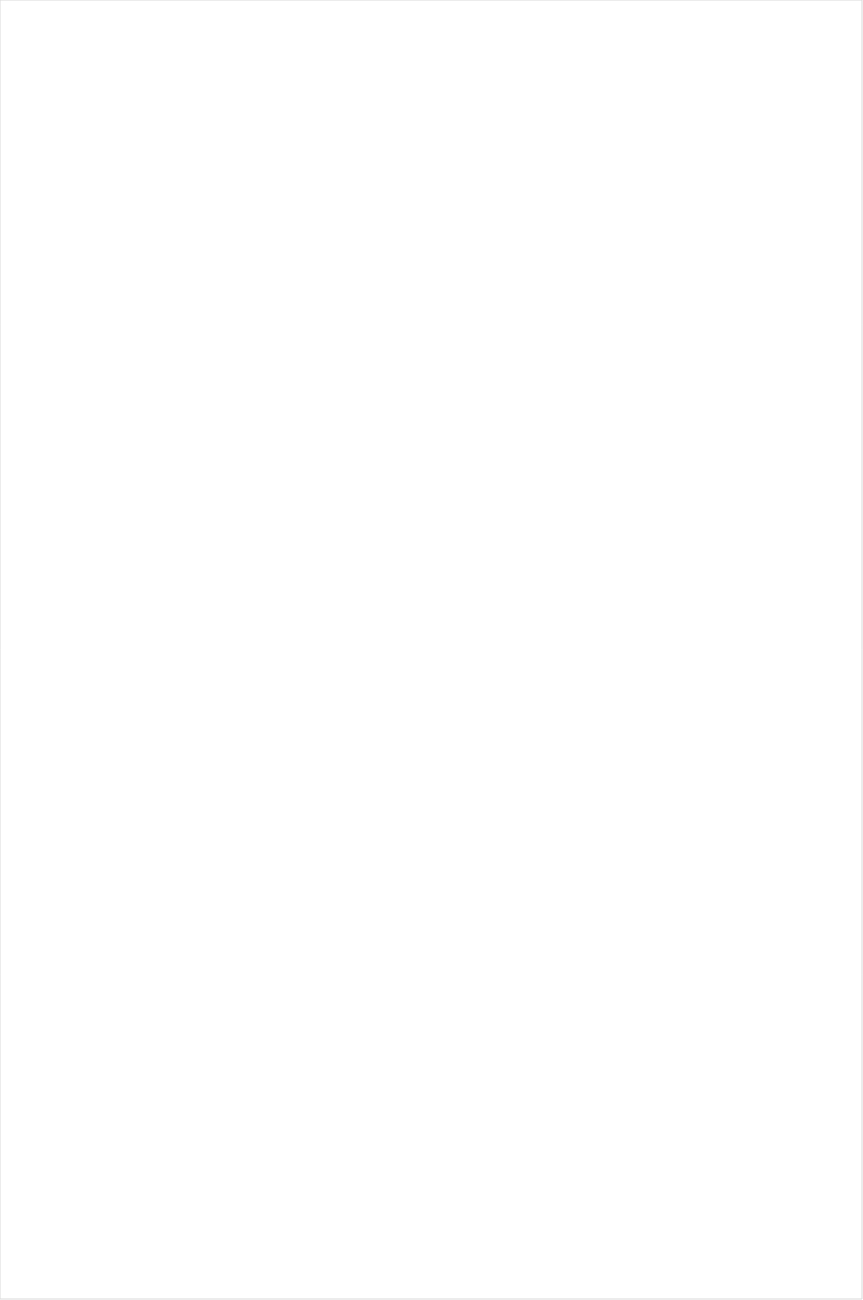
| Category | Total |
|---|---|
| TV ONE | -0.529 |
| BET Her | -0.517 |
| BET | -0.49 |
| Cartoon Network | -0.473 |
| Lifetime Movies | -0.427 |
| MyNetworkTV | -0.424 |
| Oprah Winfrey Network | -0.421 |
| Disney XD | -0.369 |
| MTV2 | -0.349 |
| Disney Channel | -0.341 |
| VH1 | -0.341 |
| Nick Toons | -0.328 |
| UniMas | -0.325 |
| TLC | -0.276 |
| Univision | -0.256 |
| WE TV | -0.256 |
| Telemundo | -0.256 |
| Travel | -0.235 |
| Nick | -0.228 |
| UP TV | -0.225 |
| Adult Swim | -0.197 |
| Logo | -0.185 |
| Nick Jr. | -0.178 |
| Hallmark | -0.177 |
| Hallmark Movies & Mysteries | -0.173 |
| Teen Nick | -0.171 |
| Universal Kids | -0.159 |
| ION | -0.158 |
| Investigation Discovery | -0.15 |
| CW | -0.14 |
| BRAVO | -0.129 |
| Lifetime | -0.129 |
| NBC Universo | -0.127 |
| CMTV | -0.125 |
| Disney Junior US | -0.122 |
| Galavision | -0.106 |
| POP | -0.097 |
| E! | -0.083 |
| OXYGEN | -0.078 |
| TUDN | -0.071 |
| Discovery Family Channel | -0.05 |
| CBS | -0.043 |
| Discovery Life Channel | -0.037 |
| Great American Country | -0.035 |
| FX | -0.025 |
| Nick@Nite | -0.023 |
| MTV | 0.025 |
| A&E | 0.05 |
| Discovery Channel | 0.053 |
| National Geographic Wild | 0.054 |
| HGTV | 0.056 |
| Ovation | 0.06 |
| Science Channel | 0.065 |
| NBC | 0.07 |
| Animal Planet | 0.075 |
| SYFY | 0.078 |
| Freeform | 0.086 |
| FXX | 0.1 |
| Motor Trend Network | 0.1 |
| MSNBC | 0.102 |
| INSP | 0.102 |
| PBS | 0.11 |
| ABC | 0.113 |
| USA Network | 0.145 |
| FX Movie Channel | 0.2 |
| History Channel | 0.204 |
| Paramount Network | 0.21 |
| WGN America | 0.217 |
| BBC America | 0.218 |
| Destination America | 0.219 |
| CNN | 0.226 |
| Food Network | 0.247 |
| Weather Channel | 0.248 |
| FOX | 0.257 |
| DIY | 0.281 |
| FYI | 0.288 |
| TV LAND | 0.291 |
| AMC | 0.309 |
| American Heroes Channel | 0.319 |
| Reelz Channel | 0.323 |
| Fox Business | 0.323 |
| RFD TV | 0.326 |
| National Geographic | 0.326 |
| Bloomberg HD | 0.333 |
| Fox News | 0.362 |
| Comedy Central | 0.389 |
| Cooking Channel | 0.404 |
| CNBC | 0.404 |
| SundanceTV | 0.418 |
| The Sportsman Channel | 0.418 |
| Independent Film (IFC) | 0.436 |
| Game Show | 0.442 |
| Viceland | 0.45 |
| Smithsonian | 0.521 |
| Outdoor Channel | 0.545 |
| TBS | 0.765 |
| TNT | 0.778 |
| ESPN Deportes | 1.012 |
| Headline News | 1.032 |
| FXDEP | 1.104 |
| Tennis Channel | 1.131 |
| Olympic Channel | 1.206 |
| truTV | 1.338 |
| Fox Sports 1 | 1.459 |
| NBA TV | 1.461 |
| CBS Sports | 1.475 |
| NFL Network | 1.478 |
| FOX Sports 2 | 1.481 |
| ESPNEWS | 1.491 |
| ESPN2 | 1.499 |
| Big Ten Network | 1.508 |
| Golf | 1.921 |
| ESPN | 2.005 |
| PAC-12 Network | 2.463 |
| NBC Sports | 2.699 |
| ESPNU | 2.808 |
| NHL | 2.872 |
| MLB Network | 5.814 |